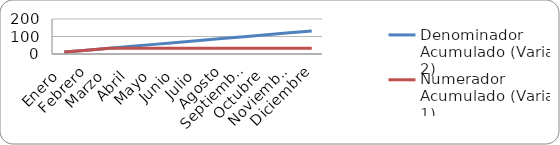
| Category | Denominador Acumulado (Variable 2) | Numerador Acumulado (Variable 1) |
|---|---|---|
| Enero  | 11 | 11 |
| Febrero | 22 | 22 |
| Marzo | 33 | 33 |
| Abril | 44 | 33 |
| Mayo | 55 | 33 |
| Junio | 66 | 33 |
| Julio | 77 | 33 |
| Agosto | 88 | 33 |
| Septiembre | 99 | 33 |
| Octubre | 110 | 33 |
| Noviembre | 121 | 33 |
| Diciembre | 132 | 33 |